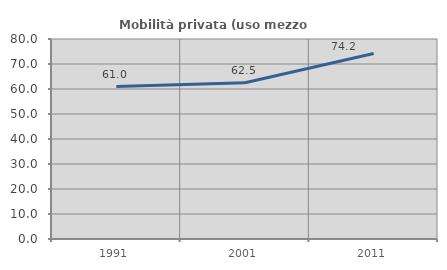
| Category | Mobilità privata (uso mezzo privato) |
|---|---|
| 1991.0 | 60.976 |
| 2001.0 | 62.5 |
| 2011.0 | 74.194 |